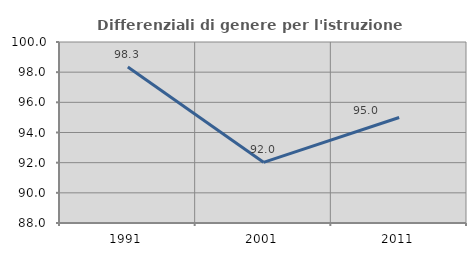
| Category | Differenziali di genere per l'istruzione superiore |
|---|---|
| 1991.0 | 98.347 |
| 2001.0 | 92.022 |
| 2011.0 | 94.992 |